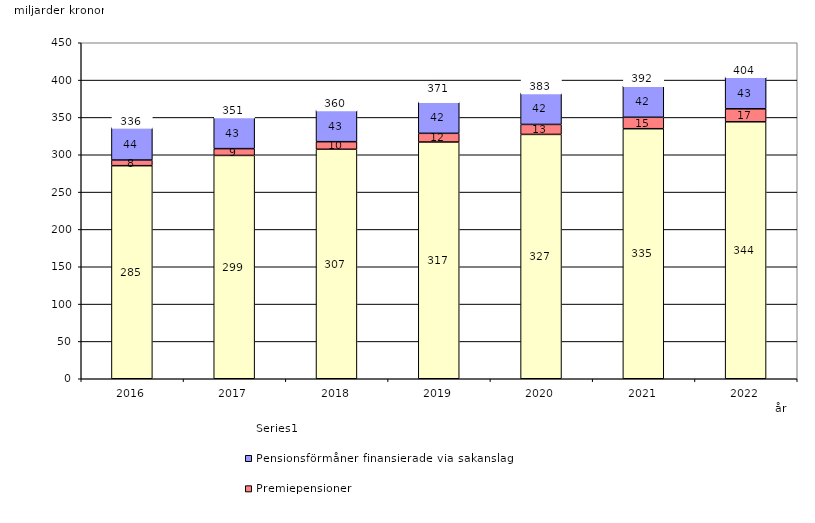
| Category | Inkomstpension och tilläggspension m.m. | Premiepensioner | Pensionsförmåner finansierade via sakanslag | Series 0 |
|---|---|---|---|---|
| 2016.0 | 285.357 | 7.598 | 43.541 | 20 |
| 2017.0 | 299.103 | 9.081 | 42.508 | 20 |
| 2018.0 | 307.355 | 10.141 | 42.538 | 20 |
| 2019.0 | 317.074 | 11.629 | 42.126 | 20 |
| 2020.0 | 327.254 | 13.376 | 42.193 | 20 |
| 2021.0 | 334.883 | 15.315 | 42.227 | 20 |
| 2022.0 | 344.166 | 17.389 | 42.773 | 20 |